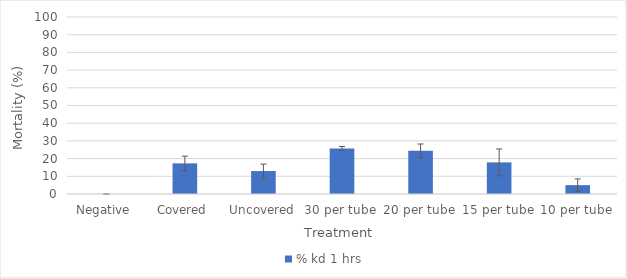
| Category | % kd 1 hrs |
|---|---|
| Negative  | 0 |
| Covered | 17.308 |
| Uncovered | 12.963 |
| 30 per tube | 25.758 |
| 20 per tube | 24.39 |
| 15 per tube | 17.857 |
| 10 per tube | 5 |